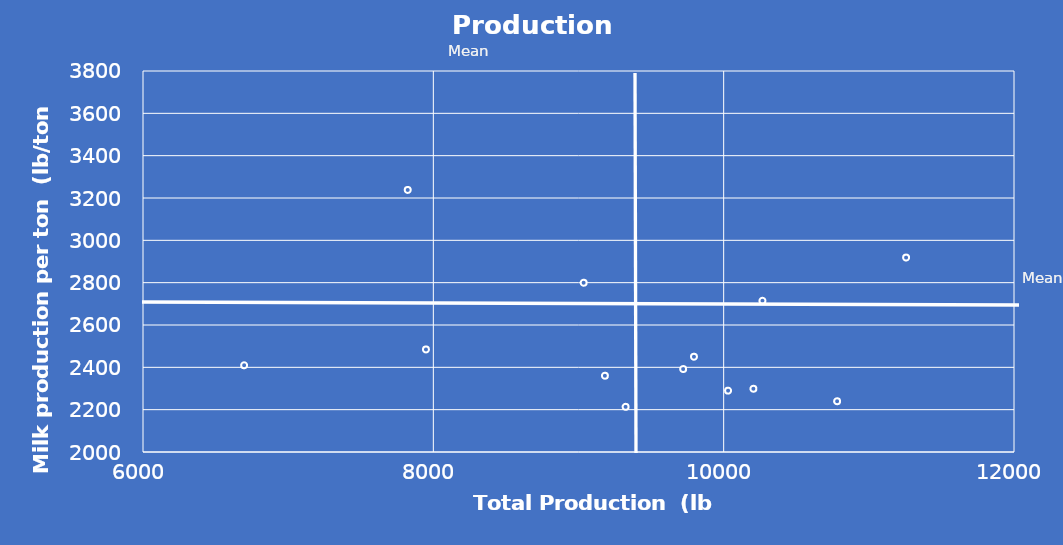
| Category | Series 0 |
|---|---|
| 10030.408426281 | 2289.821 |
| 9720.858113984 | 2391.938 |
| 10267.155419051 | 2714.541 |
| 6696.543101474 | 2409.701 |
| 10204.647188157 | 2298.838 |
| 9324.289217689 | 2213.437 |
| 7949.157845938 | 2484.444 |
| 11256.604333325 | 2918.619 |
| 10781.351441001 | 2239.779 |
| 9795.383325712 | 2450.05 |
| 9181.942248263 | 2360.342 |
| 7823.506009286 | 3238.042 |
| 9035.301478076 | 2799.709 |